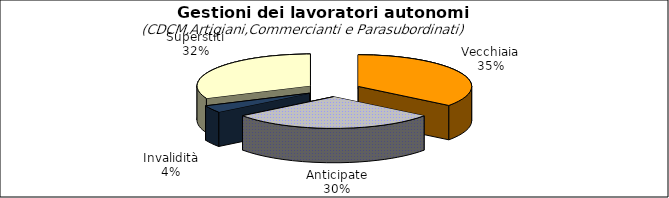
| Category | Series 0 |
|---|---|
| Vecchiaia | 61470 |
| Anticipate | 51458 |
| Invalidità | 6410 |
| Superstiti | 54930 |